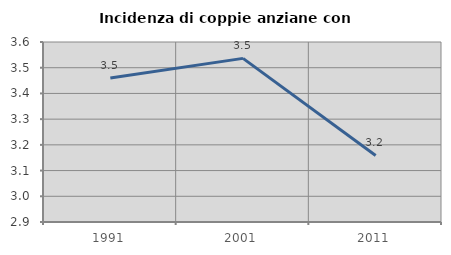
| Category | Incidenza di coppie anziane con figli |
|---|---|
| 1991.0 | 3.46 |
| 2001.0 | 3.536 |
| 2011.0 | 3.159 |